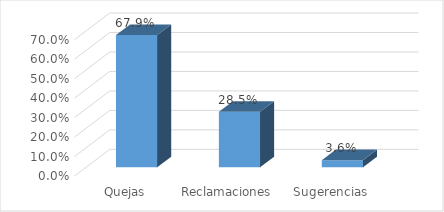
| Category | PORCENTAJE |
|---|---|
| Quejas | 0.679 |
| Reclamaciones | 0.285 |
| Sugerencias | 0.036 |